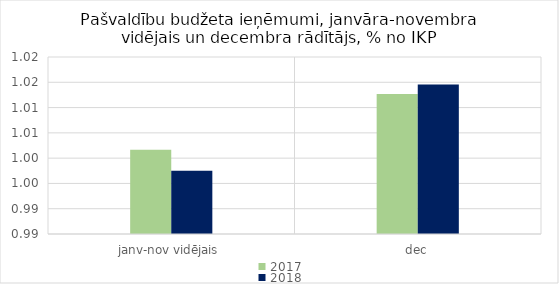
| Category | 2017 | 2018 |
|---|---|---|
| janv-nov vidējais | 1.002 | 0.997 |
| dec | 1.013 | 1.015 |